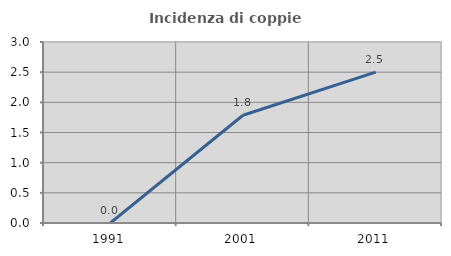
| Category | Incidenza di coppie miste |
|---|---|
| 1991.0 | 0 |
| 2001.0 | 1.786 |
| 2011.0 | 2.5 |